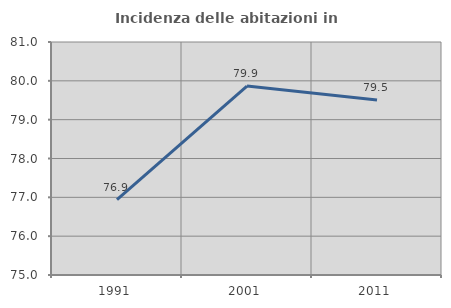
| Category | Incidenza delle abitazioni in proprietà  |
|---|---|
| 1991.0 | 76.94 |
| 2001.0 | 79.865 |
| 2011.0 | 79.506 |